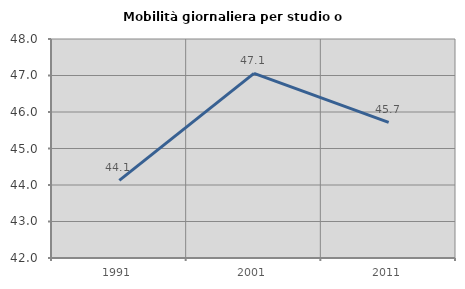
| Category | Mobilità giornaliera per studio o lavoro |
|---|---|
| 1991.0 | 44.127 |
| 2001.0 | 47.059 |
| 2011.0 | 45.714 |